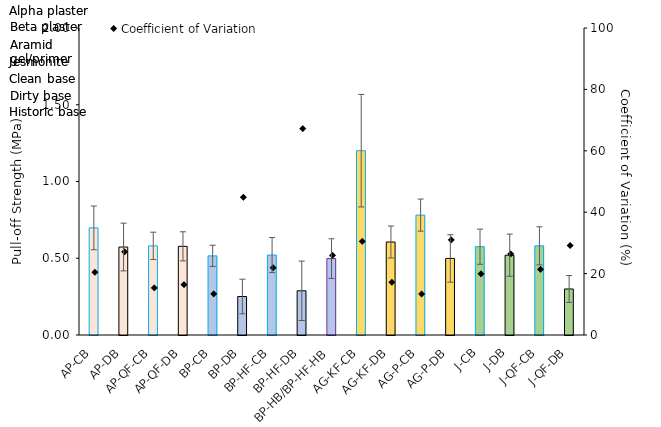
| Category | Mean |
|---|---|
| AP-CB | 0.698 |
| AP-DB | 0.573 |
| AP-QF-CB | 0.581 |
| AP-QF-DB | 0.578 |
| BP-CB | 0.516 |
| BP-DB | 0.251 |
| BP-HF-CB | 0.521 |
| BP-HF-DB | 0.288 |
| BP-HB/BP-HF-HB | 0.498 |
| AG-KF-CB | 1.201 |
| AG-KF-DB | 0.606 |
| AG-P-CB | 0.781 |
| AG-P-DB | 0.499 |
| J-CB | 0.575 |
| J-DB | 0.52 |
| J-QF-CB | 0.581 |
| J-QF-DB | 0.3 |